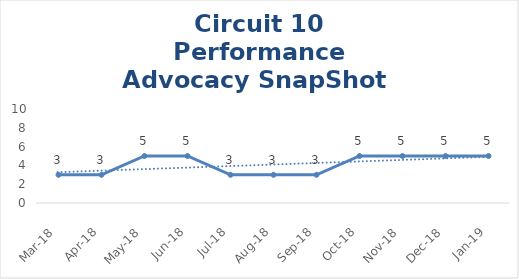
| Category | Circuit 10 |
|---|---|
| Mar-18 | 3 |
| Apr-18 | 3 |
| May-18 | 5 |
| Jun-18 | 5 |
| Jul-18 | 3 |
| Aug-18 | 3 |
| Sep-18 | 3 |
| Oct-18 | 5 |
| Nov-18 | 5 |
| Dec-18 | 5 |
| Jan-19 | 5 |